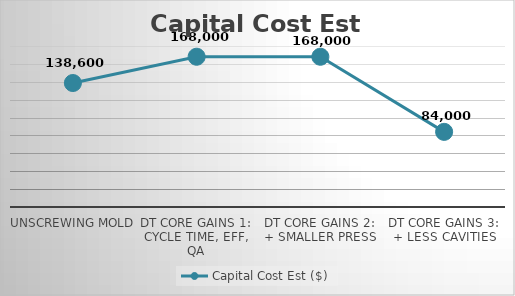
| Category | Capital Cost Est ($) |
|---|---|
| Unscrewing Mold | 138600 |
| DT Core Gains 1:
Cycle Time, Eff, QA | 168000 |
| DT Core Gains 2:
+ Smaller Press | 168000 |
| DT Core Gains 3:
+ Less Cavities | 84000 |